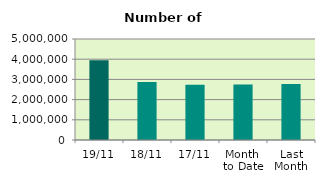
| Category | Series 0 |
|---|---|
| 19/11 | 3948486 |
| 18/11 | 2865982 |
| 17/11 | 2738570 |
| Month 
to Date | 2749398.8 |
| Last
Month | 2771381.143 |